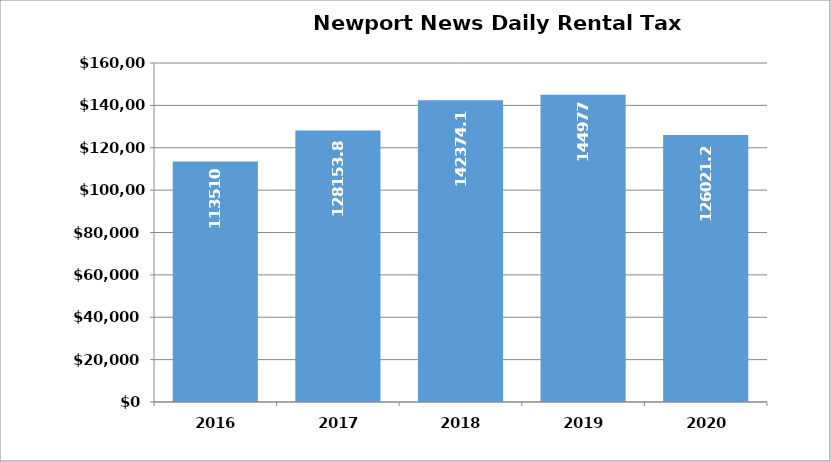
| Category | Series 0 |
|---|---|
| 2016.0 | 113510 |
| 2017.0 | 128153.85 |
| 2018.0 | 142374.16 |
| 2019.0 | 144977 |
| 2020.0 | 126021.25 |